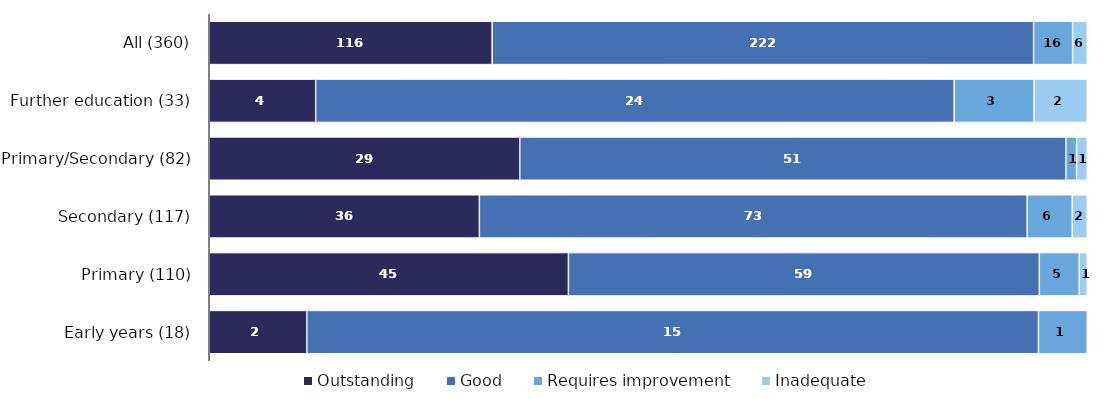
| Category | Outstanding | Good | Requires improvement | Inadequate |
|---|---|---|---|---|
| Early years (18) | 2 | 15 | 1 | 0 |
| Primary (110) | 45 | 59 | 5 | 1 |
| Secondary (117) | 36 | 73 | 6 | 2 |
| Primary/Secondary (82) | 29 | 51 | 1 | 1 |
| Further education (33) | 4 | 24 | 3 | 2 |
| All (360) | 116 | 222 | 16 | 6 |